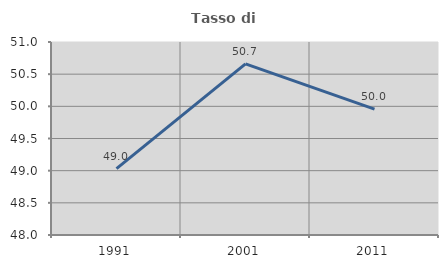
| Category | Tasso di occupazione   |
|---|---|
| 1991.0 | 49.033 |
| 2001.0 | 50.659 |
| 2011.0 | 49.956 |